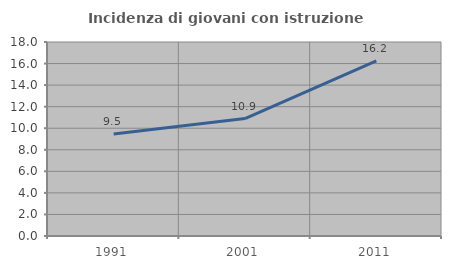
| Category | Incidenza di giovani con istruzione universitaria |
|---|---|
| 1991.0 | 9.455 |
| 2001.0 | 10.894 |
| 2011.0 | 16.242 |